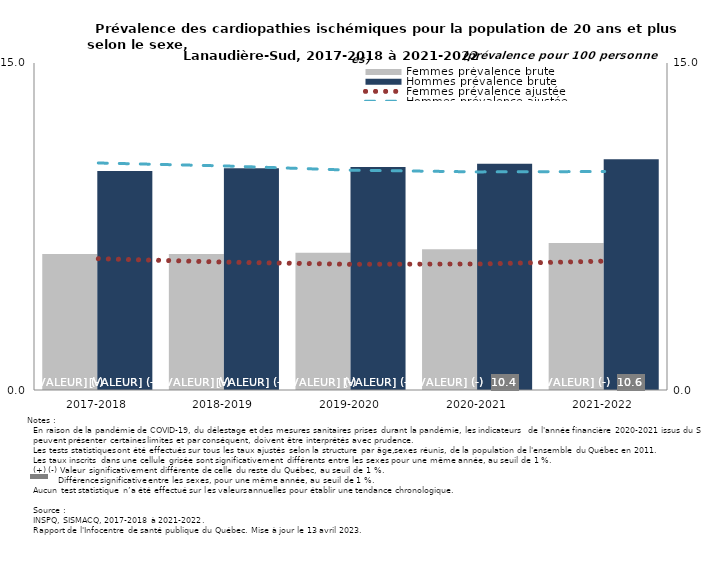
| Category | Femmes prévalence brute | Hommes prévalence brute |
|---|---|---|
| 2017-2018 | 6.24 | 10.042 |
| 2018-2019 | 6.242 | 10.169 |
| 2019-2020 | 6.294 | 10.225 |
| 2020-2021 | 6.456 | 10.376 |
| 2021-2022 | 6.742 | 10.588 |